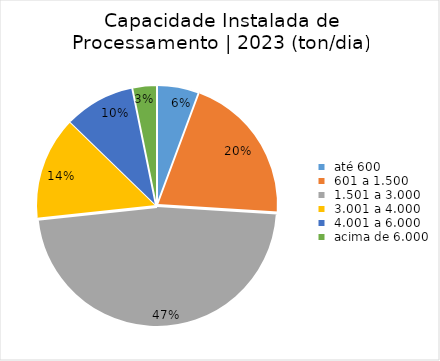
| Category | Series 0 |
|---|---|
|  até 600  | 11880 |
|  601 a 1.500  | 42624 |
|  1.501 a 3.000  | 99136 |
|  3.001 a 4.000  | 29292 |
|  4.001 a 6.000  | 20000 |
|  acima de 6.000  | 6700 |